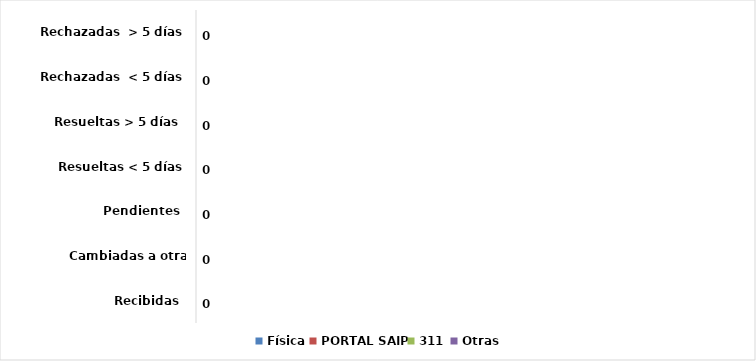
| Category | Física | PORTAL SAIP | 311 | Otras |
|---|---|---|---|---|
| Recibidas  | 0 | 0 | 0 | 0 |
| Cambiadas a otra institución | 0 | 0 | 0 | 0 |
| Pendientes  | 0 | 0 | 0 | 0 |
| Resueltas < 5 días | 0 | 0 | 0 | 0 |
| Resueltas > 5 días  | 0 | 0 | 0 | 0 |
| Rechazadas  < 5 días | 0 | 0 | 0 | 0 |
| Rechazadas  > 5 días | 0 | 0 | 0 | 0 |